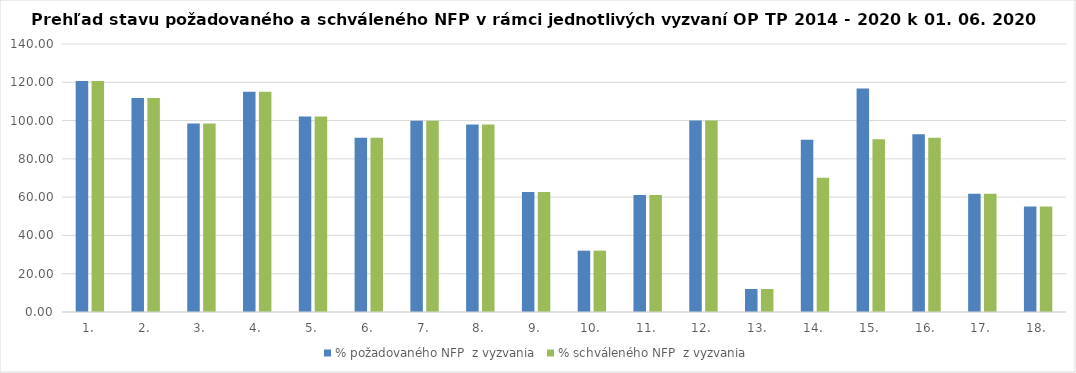
| Category | % požadovaného NFP  z vyzvania | % schváleného NFP  z vyzvania |
|---|---|---|
| 1. | 120.662 | 120.662 |
| 2. | 111.83 | 111.83 |
| 3. | 98.465 | 98.465 |
| 4. | 115.112 | 115.112 |
| 5. | 102.181 | 102.181 |
| 6. | 91.007 | 91.007 |
| 7. | 99.954 | 99.954 |
| 8. | 97.989 | 97.989 |
| 9. | 62.721 | 62.721 |
| 10. | 32.038 | 32.038 |
| 11. | 61.165 | 61.165 |
| 12. | 99.986 | 99.986 |
| 13. | 12.007 | 12.007 |
| 14. | 89.98 | 70.105 |
| 15. | 116.774 | 90.273 |
| 16. | 92.892 | 91.076 |
| 17. | 61.748 | 61.748 |
| 18. | 55.058 | 55.058 |